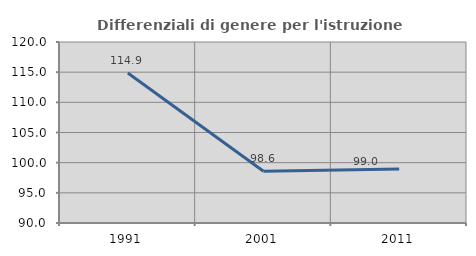
| Category | Differenziali di genere per l'istruzione superiore |
|---|---|
| 1991.0 | 114.855 |
| 2001.0 | 98.571 |
| 2011.0 | 98.971 |